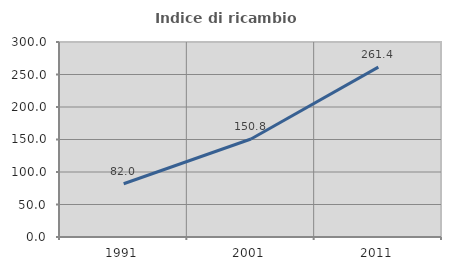
| Category | Indice di ricambio occupazionale  |
|---|---|
| 1991.0 | 81.967 |
| 2001.0 | 150.769 |
| 2011.0 | 261.353 |